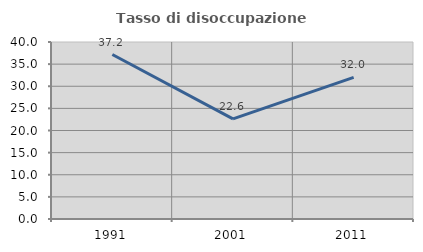
| Category | Tasso di disoccupazione giovanile  |
|---|---|
| 1991.0 | 37.168 |
| 2001.0 | 22.619 |
| 2011.0 | 32 |